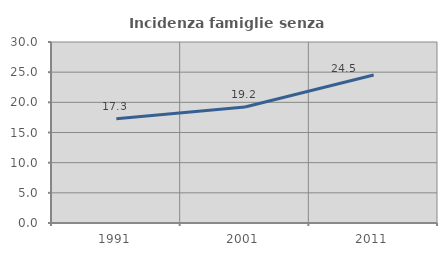
| Category | Incidenza famiglie senza nuclei |
|---|---|
| 1991.0 | 17.277 |
| 2001.0 | 19.239 |
| 2011.0 | 24.523 |